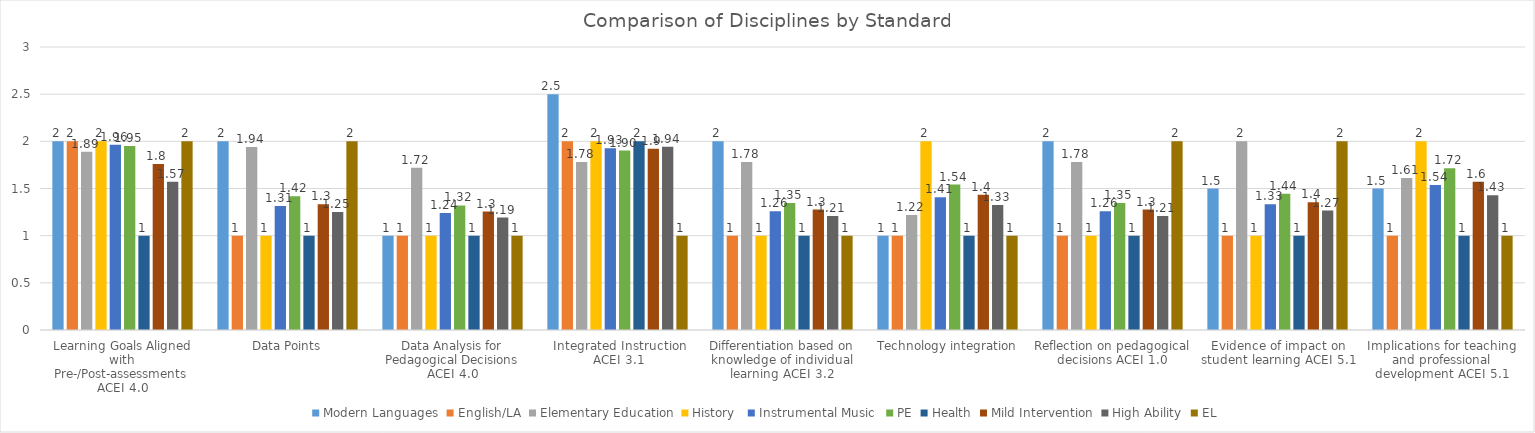
| Category | Modern Languages | English/LA | Elementary Education | History  | Instrumental Music  | PE | Health | Mild Intervention | High Ability | EL |
|---|---|---|---|---|---|---|---|---|---|---|
| Learning Goals Aligned with Pre-/Post-assessments ACEI 4.0 | 2 | 2 | 1.89 | 2 | 1.963 | 1.951 | 1 | 1.761 | 1.571 | 2 |
| Data Points | 2 | 1 | 1.94 | 1 | 1.313 | 1.418 | 1 | 1.334 | 1.251 | 2 |
| Data Analysis for Pedagogical Decisions ACEI 4.0 | 1 | 1 | 1.72 | 1 | 1.24 | 1.32 | 1 | 1.256 | 1.192 | 1 |
| Integrated Instruction ACEI 3.1 | 2.5 | 2 | 1.78 | 2 | 1.927 | 1.902 | 2 | 1.922 | 1.941 | 1 |
| Differentiation based on knowledge of individual learning ACEI 3.2 | 2 | 1 | 1.78 | 1 | 1.26 | 1.347 | 1 | 1.277 | 1.208 | 1 |
| Technology integration | 1 | 1 | 1.22 | 2 | 1.407 | 1.542 | 1 | 1.434 | 1.325 | 1 |
| Reflection on pedagogical decisions ACEI 1.0 | 2 | 1 | 1.78 | 1 | 1.26 | 1.347 | 1 | 1.277 | 1.208 | 2 |
| Evidence of impact on student learning ACEI 5.1 | 1.5 | 1 | 2 | 1 | 1.333 | 1.444 | 1 | 1.356 | 1.267 | 2 |
| Implications for teaching and professional development ACEI 5.1 | 1.5 | 1 | 1.61 | 2 | 1.537 | 1.716 | 1 | 1.572 | 1.429 | 1 |